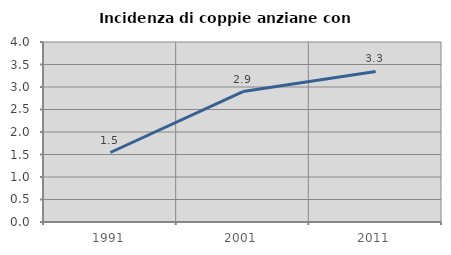
| Category | Incidenza di coppie anziane con figli |
|---|---|
| 1991.0 | 1.544 |
| 2001.0 | 2.899 |
| 2011.0 | 3.346 |